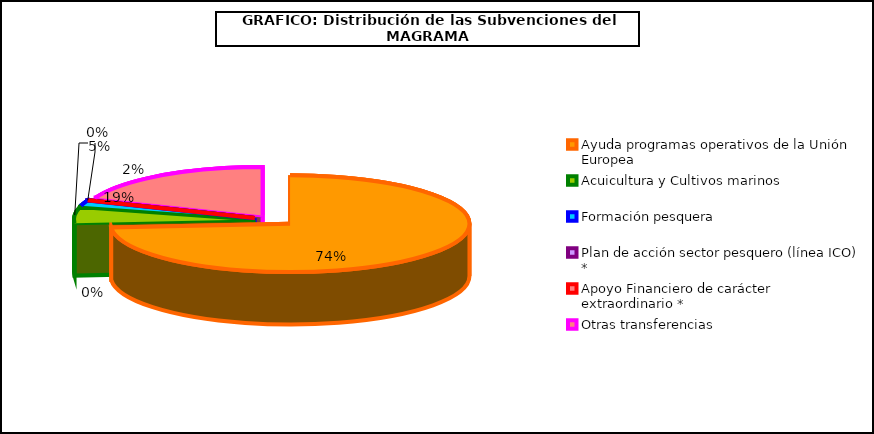
| Category | Ayuda programas operativos de la Unión Europea  Acuicultura y Cultivos marinos Formación pesquera Plan de acción sector pesquero (línea ICO) * Apoyo Financiero de carácter extraordinario * Otras transferencias |
|---|---|
| Ayuda programas operativos de la Unión Europea  | 4364.68 |
| Acuicultura y Cultivos marinos | 318.23 |
| Formación pesquera | 106.93 |
| Plan de acción sector pesquero (línea ICO) * | 0 |
| Apoyo Financiero de carácter extraordinario * | 0 |
| Otras transferencias | 1127.15 |